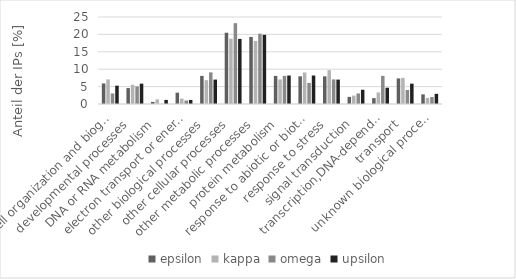
| Category | epsilon | kappa | omega | upsilon |
|---|---|---|---|---|
| cell organization and biogenesis  | 5.904 | 7.064 | 3.03 | 5.263 |
| developmental processes  | 4.578 | 5.519 | 5.051 | 5.848 |
| DNA or RNA metabolism  | 0.602 | 1.325 | 0 | 1.17 |
| electron transport or energy pathways  | 3.253 | 1.545 | 1.01 | 1.17 |
| other biological processes  | 8.072 | 6.843 | 9.091 | 7.018 |
| other cellular processes  | 20.482 | 18.764 | 23.232 | 18.713 |
| other metabolic processes  | 19.277 | 18.102 | 20.202 | 19.883 |
| protein metabolism  | 8.072 | 7.064 | 8.081 | 8.187 |
| response to abiotic or biotic stimulus  | 7.952 | 9.051 | 6.061 | 8.187 |
| response to stress  | 7.952 | 9.713 | 7.071 | 7.018 |
| signal transduction  | 2.048 | 2.428 | 3.03 | 4.094 |
| transcription,DNA-dependent  | 1.687 | 3.311 | 8.081 | 4.678 |
| transport  | 7.349 | 7.506 | 4.04 | 5.848 |
| unknown biological processes  | 2.771 | 1.766 | 2.02 | 2.924 |